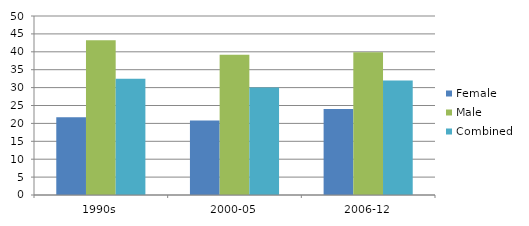
| Category | Female | Male | Combined |
|---|---|---|---|
| 1990s | 21.7 | 43.2 | 32.5 |
| 2000-05 | 20.8 | 39.2 | 30 |
| 2006-12 | 24 | 39.9 | 32 |